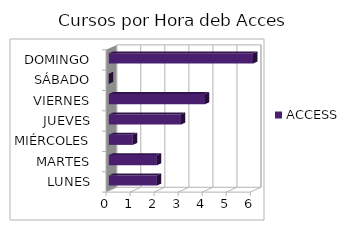
| Category | ACCESS |
|---|---|
| LUNES | 2 |
| MARTES | 2 |
| MIÉRCOLES | 1 |
| JUEVES | 3 |
| VIERNES | 4 |
| SÁBADO | 0 |
| DOMINGO | 6 |